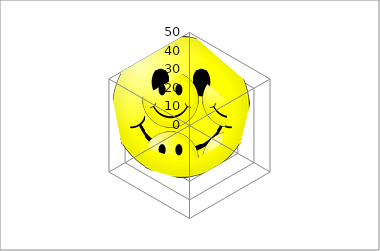
| Category | Series 1 | Series 2 |
|---|---|---|
| Point 1 | 50 | 30 |
| Point 2 | 40 | 25 |
| Point 3 | 30 | 20 |
| Point 4 | 30 | 20 |
| Point 5 | 40 | 25 |
| Point 6 | 50 | 30 |